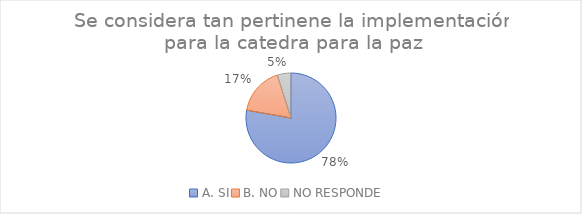
| Category | Series 0 |
|---|---|
| A. SI | 63 |
| B. NO | 14 |
| NO RESPONDE  | 4 |